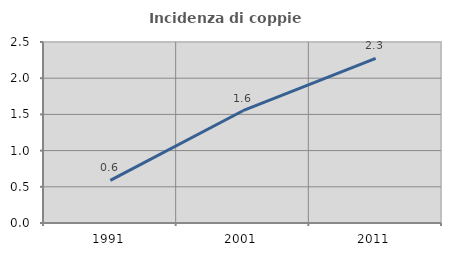
| Category | Incidenza di coppie miste |
|---|---|
| 1991.0 | 0.588 |
| 2001.0 | 1.551 |
| 2011.0 | 2.273 |